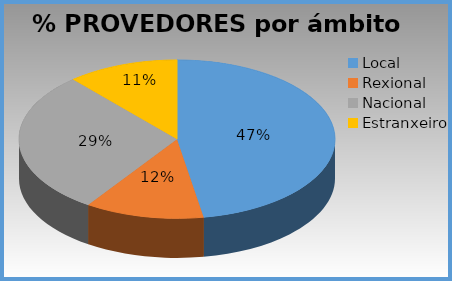
| Category | % provedores |
|---|---|
| Local | 0.473 |
| Rexional | 0.122 |
| Nacional | 0.291 |
| Estranxeiro | 0.114 |